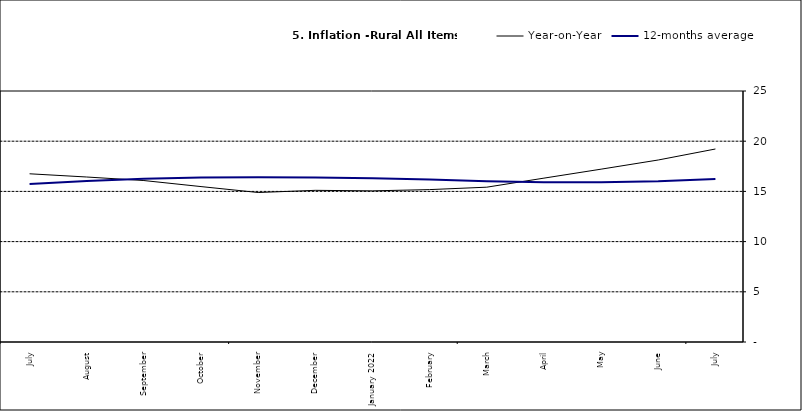
| Category | Year-on-Year | 12-months average |
|---|---|---|
| July | 16.753 | 15.726 |
| August | 16.433 | 16.03 |
| September | 16.081 | 16.26 |
| October | 15.48 | 16.393 |
| November | 14.89 | 16.419 |
| December | 15.106 | 16.397 |
| January 2022 | 15.055 | 16.313 |
| February | 15.179 | 16.176 |
| March | 15.421 | 15.999 |
| April | 16.321 | 15.908 |
| May | 17.215 | 15.915 |
| June | 18.128 | 16.017 |
| July | 19.224 | 16.246 |